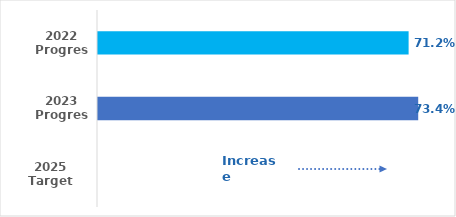
| Category | Series 0 |
|---|---|
| 2022 Progress | 0.712 |
| 2023 Progress | 0.734 |
| 2025 Target | 0 |